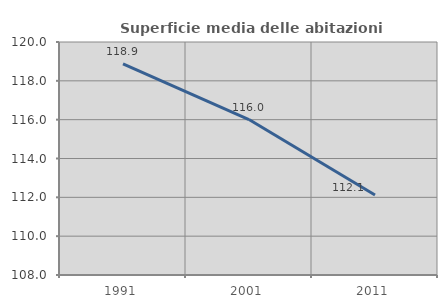
| Category | Superficie media delle abitazioni occupate |
|---|---|
| 1991.0 | 118.877 |
| 2001.0 | 116.005 |
| 2011.0 | 112.119 |